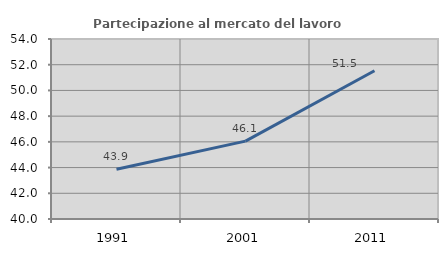
| Category | Partecipazione al mercato del lavoro  femminile |
|---|---|
| 1991.0 | 43.865 |
| 2001.0 | 46.058 |
| 2011.0 | 51.533 |